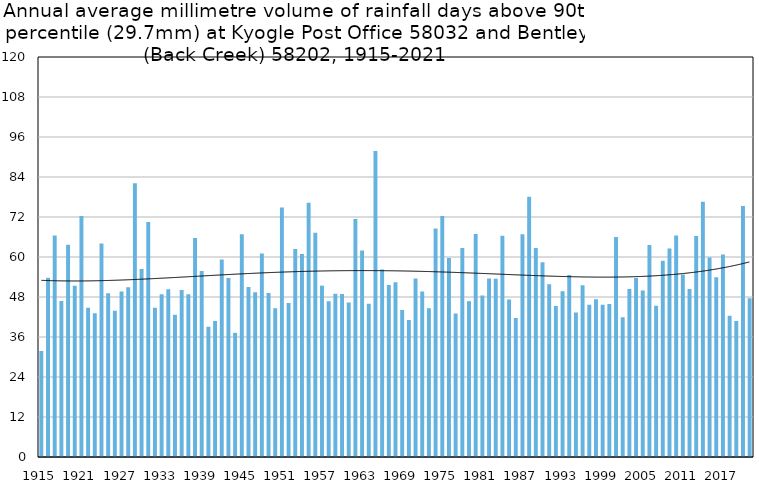
| Category | Annual average mm in days above 90th percentile |
|---|---|
| 1915 | 31.8 |
| 1916 | 53.754 |
| 1917 | 66.462 |
| 1918 | 46.817 |
| 1919 | 63.65 |
| 1920 | 51.345 |
| 1921 | 72.32 |
| 1922 | 44.767 |
| 1923 | 43.114 |
| 1924 | 64.083 |
| 1925 | 49.126 |
| 1926 | 43.886 |
| 1927 | 49.658 |
| 1928 | 50.956 |
| 1929 | 82.14 |
| 1930 | 56.425 |
| 1931 | 70.475 |
| 1932 | 44.775 |
| 1933 | 48.8 |
| 1934 | 50.309 |
| 1935 | 42.656 |
| 1936 | 50.117 |
| 1937 | 48.847 |
| 1938 | 65.711 |
| 1939 | 55.77 |
| 1940 | 39.075 |
| 1941 | 40.82 |
| 1942 | 59.256 |
| 1943 | 53.738 |
| 1944 | 37.25 |
| 1945 | 66.857 |
| 1946 | 50.97 |
| 1947 | 49.442 |
| 1948 | 61.029 |
| 1949 | 49.19 |
| 1950 | 44.65 |
| 1951 | 74.844 |
| 1952 | 46.212 |
| 1953 | 62.382 |
| 1954 | 60.916 |
| 1955 | 76.28 |
| 1956 | 67.257 |
| 1957 | 51.417 |
| 1958 | 46.722 |
| 1959 | 48.952 |
| 1960 | 48.867 |
| 1961 | 46.344 |
| 1962 | 71.413 |
| 1963 | 61.975 |
| 1964 | 45.989 |
| 1965 | 91.788 |
| 1966 | 56.214 |
| 1967 | 51.595 |
| 1968 | 52.457 |
| 1969 | 44.1 |
| 1970 | 41.1 |
| 1971 | 53.557 |
| 1972 | 49.652 |
| 1973 | 44.623 |
| 1974 | 68.557 |
| 1975 | 72.3 |
| 1976 | 59.7 |
| 1977 | 43.067 |
| 1978 | 62.72 |
| 1979 | 46.75 |
| 1980 | 66.9 |
| 1981 | 48.436 |
| 1982 | 53.52 |
| 1983 | 53.471 |
| 1984 | 66.4 |
| 1985 | 47.218 |
| 1986 | 41.714 |
| 1987 | 66.84 |
| 1988 | 78.083 |
| 1989 | 62.667 |
| 1990 | 58.46 |
| 1991 | 51.85 |
| 1992 | 45.286 |
| 1993 | 49.72 |
| 1994 | 54.6 |
| 1995 | 43.32 |
| 1996 | 51.5 |
| 1997 | 45.657 |
| 1998 | 47.333 |
| 1999 | 45.671 |
| 2000 | 45.88 |
| 2001 | 65.991 |
| 2002 | 41.914 |
| 2003 | 50.429 |
| 2004 | 53.712 |
| 2005 | 49.933 |
| 2006 | 63.582 |
| 2007 | 45.38 |
| 2008 | 58.862 |
| 2009 | 62.573 |
| 2010 | 66.46 |
| 2011 | 54.773 |
| 2012 | 50.427 |
| 2013 | 66.327 |
| 2014 | 76.56 |
| 2015 | 59.817 |
| 2016 | 53.9 |
| 2017 | 60.733 |
| 2018 | 42.4 |
| 2019 | 40.8 |
| 2020 | 75.3 |
| 2021 | 47.615 |